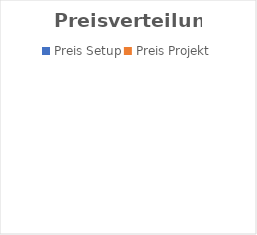
| Category | Series 0 |
|---|---|
| Preis Setup | 0 |
| Preis Projekt | 0 |